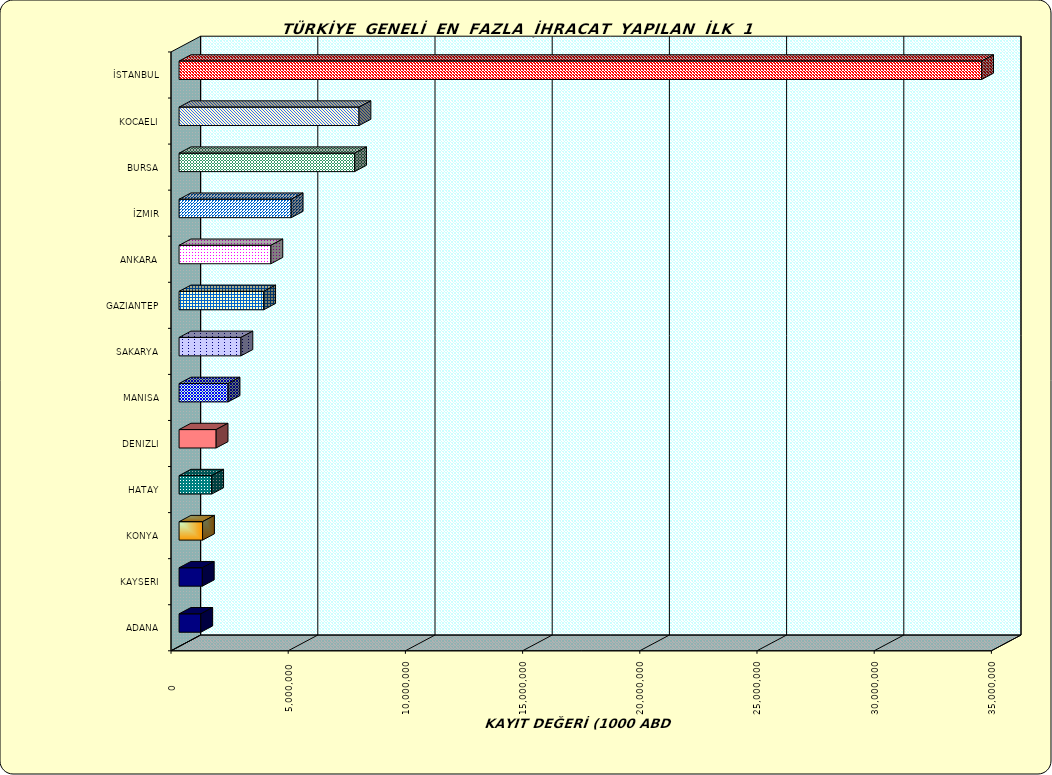
| Category | Series 0 |
|---|---|
| İSTANBUL | 34239554.669 |
| KOCAELI | 7675976.744 |
| BURSA | 7489339.873 |
| İZMIR | 4783726.336 |
| ANKARA | 3917697.097 |
| GAZIANTEP | 3610908.774 |
| SAKARYA | 2639267.927 |
| MANISA | 2090983.402 |
| DENIZLI | 1581433.534 |
| HATAY | 1392374.092 |
| KONYA | 1002522.763 |
| KAYSERI | 991524.257 |
| ADANA | 927013.111 |